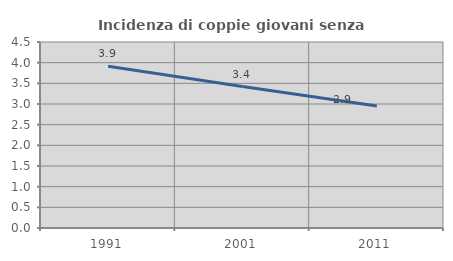
| Category | Incidenza di coppie giovani senza figli |
|---|---|
| 1991.0 | 3.912 |
| 2001.0 | 3.421 |
| 2011.0 | 2.95 |